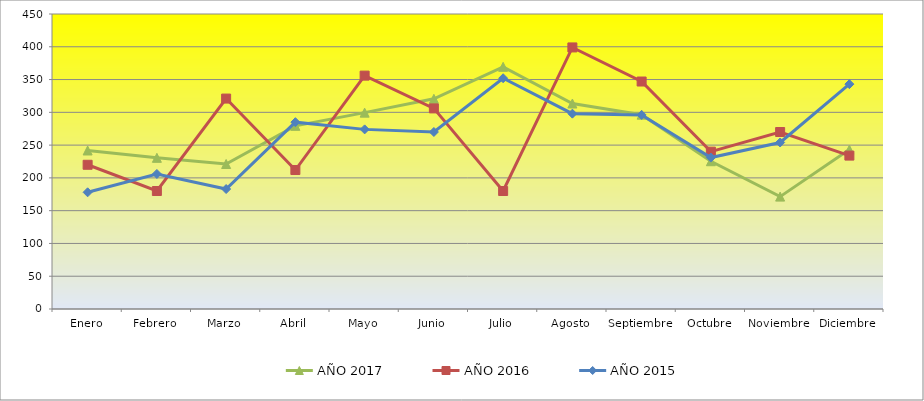
| Category | AÑO 2017 | AÑO 2016 | AÑO 2015 |
|---|---|---|---|
| Enero | 241.791 | 220 | 178 |
| Febrero | 230.597 | 180 | 206 |
| Marzo | 221.194 | 321 | 183 |
| Abril | 279.403 | 212 | 285 |
| Mayo | 299.552 | 356 | 274 |
| Junio | 320.597 | 306 | 270 |
| Julio | 369.403 | 180 | 352 |
| Agosto | 313.433 | 399 | 298 |
| Septiembre | 296.418 | 347 | 296 |
| Octubre | 225.429 | 240 | 231 |
| Noviembre | 171.429 | 270 | 254 |
| Diciembre | 243.134 | 234 | 343 |